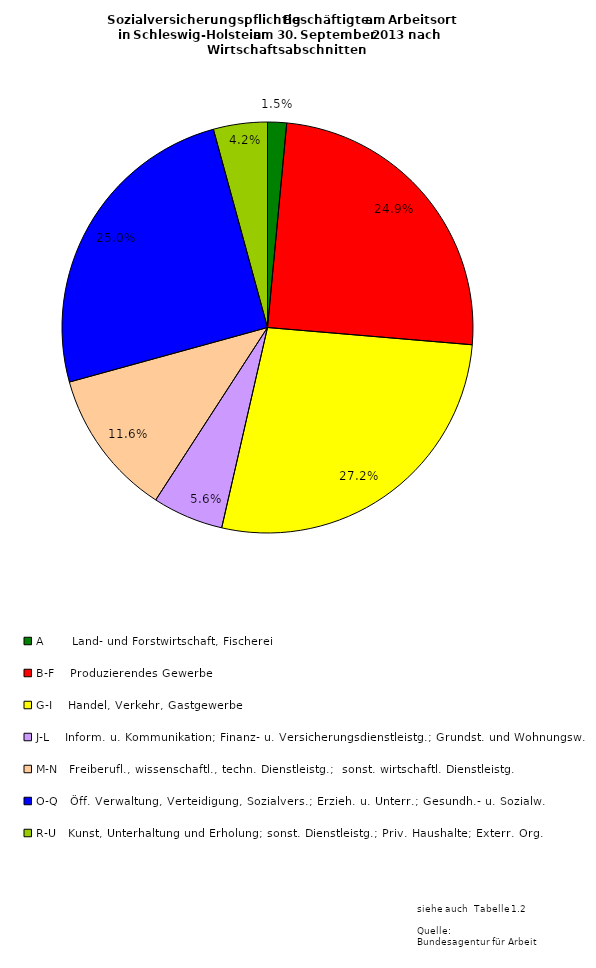
| Category | Series 0 | Series 1 | Series 2 |
|---|---|---|---|
| A       Land- und Forstwirtschaft, Fischerei | 13233 | 3550 | 9683 |
| B-F    Produzierendes Gewerbe | 220042 | 50350 | 169692 |
| G-I    Handel, Verkehr, Gastgewerbe | 241219 | 109795 | 131424 |
| J-L    Inform. u. Kommunikation; Finanz- u. Versicherungsdienstleistg.; Grundst. und Wohnungsw. | 49341 | 24054 | 25287 |
| M-N   Freiberufl., wissenschaftl., techn. Dienstleistg.;  sonst. wirtschaftl. Dienstleistg.  | 102489 | 48492 | 53997 |
| O-Q   Öff. Verwaltung, Verteidigung, Sozialvers.; Erzieh. u. Unterr.; Gesundh.- u. Sozialw. | 221695 | 161023 | 60672 |
| R-U   Kunst, Unterhaltung und Erholung; sonst. Dienstleistg.; Priv. Haushalte; Exterr. Org. | 37573 | 25861 | 11712 |